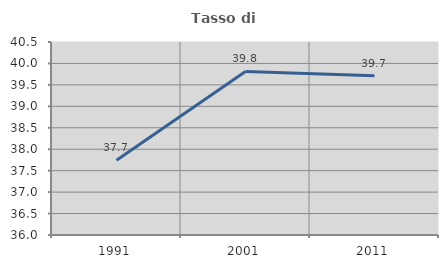
| Category | Tasso di occupazione   |
|---|---|
| 1991.0 | 37.743 |
| 2001.0 | 39.812 |
| 2011.0 | 39.715 |